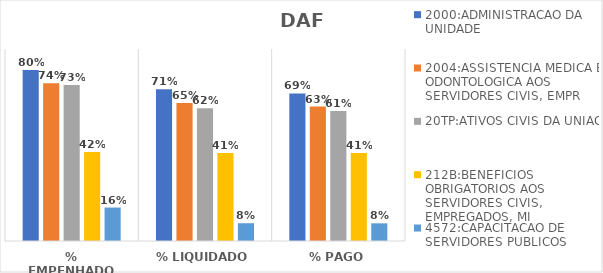
| Category | 2000:ADMINISTRACAO DA UNIDADE | 2004:ASSISTENCIA MEDICA E ODONTOLOGICA AOS SERVIDORES CIVIS, EMPR | 20TP:ATIVOS CIVIS DA UNIAO | 212B:BENEFICIOS OBRIGATORIOS AOS SERVIDORES CIVIS, EMPREGADOS, MI | 4572:CAPACITACAO DE SERVIDORES PUBLICOS FEDERAIS EM PROCESSO DE Q |
|---|---|---|---|---|---|
| % EMPENHADO | 0.802 | 0.739 | 0.731 | 0.417 | 0.157 |
| % LIQUIDADO | 0.712 | 0.647 | 0.622 | 0.412 | 0.083 |
| % PAGO | 0.692 | 0.63 | 0.609 | 0.412 | 0.083 |